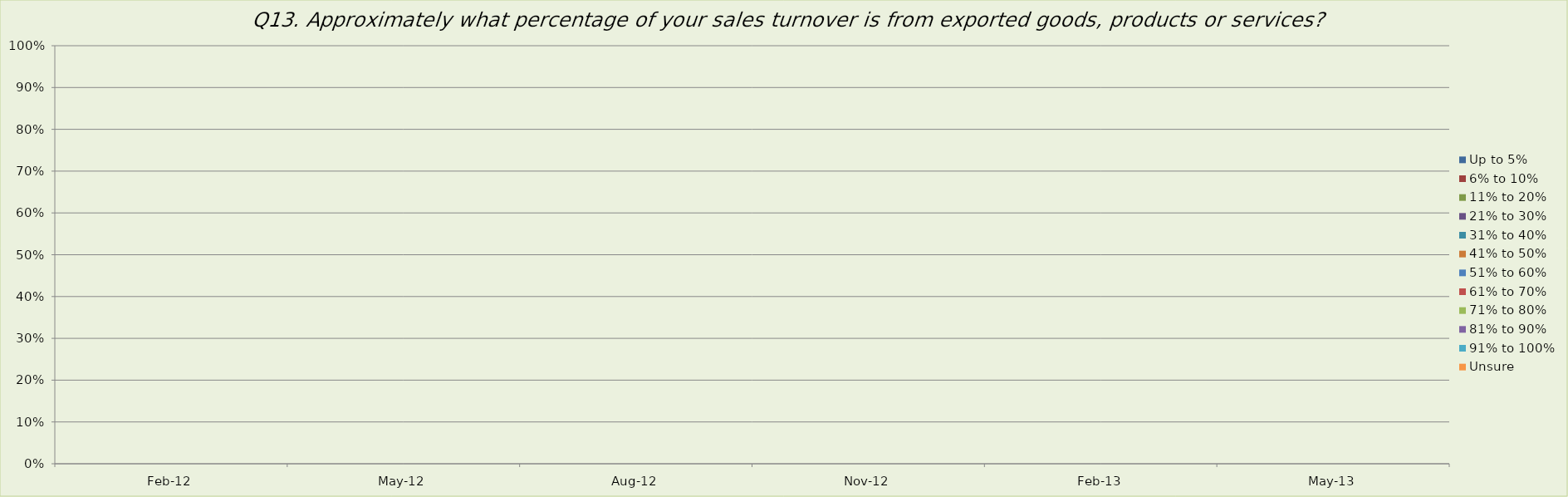
| Category | Up to 5%  | 6% to 10% | 11% to 20% | 21% to 30% | 31% to 40% | 41% to 50% | 51% to 60% | 61% to 70% | 71% to 80% | 81% to 90% | 91% to 100% | Unsure |
|---|---|---|---|---|---|---|---|---|---|---|---|---|
| 2012-02-01 | 0 | 0 | 0 | 0 | 0 | 0 | 0 | 0 | 0 | 0 | 0 | 0 |
| 2012-05-01 | 0 | 0 | 0 | 0 | 0 | 0 | 0 | 0 | 0 | 0 | 0 | 0 |
| 2012-08-01 | 0 | 0 | 0 | 0 | 0 | 0 | 0 | 0 | 0 | 0 | 0 | 0 |
| 2012-11-01 | 0 | 0 | 0 | 0 | 0 | 0 | 0 | 0 | 0 | 0 | 0 | 0 |
| 2013-02-01 | 0 | 0 | 0 | 0 | 0 | 0 | 0 | 0 | 0 | 0 | 0 | 0 |
| 2013-05-01 | 0 | 0 | 0 | 0 | 0 | 0 | 0 | 0 | 0 | 0 | 0 | 0 |